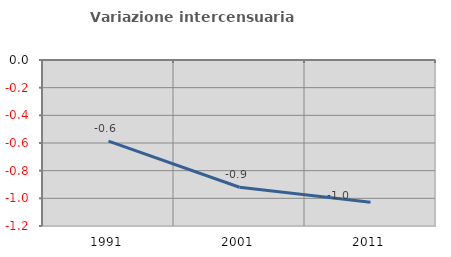
| Category | Variazione intercensuaria annua |
|---|---|
| 1991.0 | -0.587 |
| 2001.0 | -0.92 |
| 2011.0 | -1.029 |